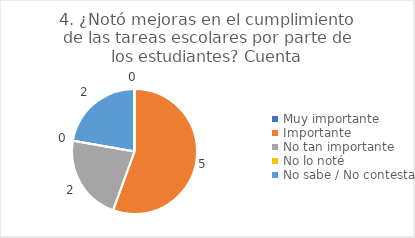
| Category | 4. ¿Notó mejoras en el cumplimiento de las tareas escolares por parte de los estudiantes? |
|---|---|
| Muy importante  | 0 |
| Importante  | 0.556 |
| No tan importante  | 0.222 |
| No lo noté  | 0 |
| No sabe / No contesta | 0.222 |